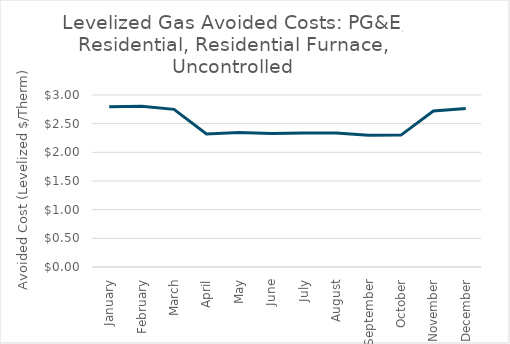
| Category | New Total |
|---|---|
| January | 2.794 |
| February | 2.805 |
| March | 2.75 |
| April | 2.322 |
| May | 2.346 |
| June | 2.33 |
| July | 2.335 |
| August | 2.339 |
| September | 2.296 |
| October | 2.301 |
| November | 2.72 |
| December | 2.765 |